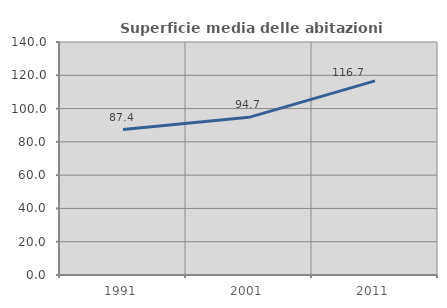
| Category | Superficie media delle abitazioni occupate |
|---|---|
| 1991.0 | 87.424 |
| 2001.0 | 94.715 |
| 2011.0 | 116.654 |